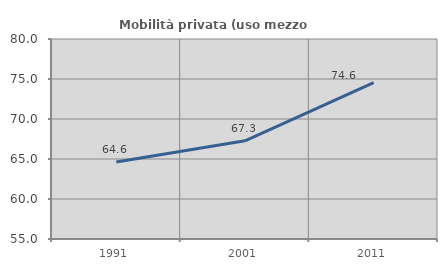
| Category | Mobilità privata (uso mezzo privato) |
|---|---|
| 1991.0 | 64.638 |
| 2001.0 | 67.273 |
| 2011.0 | 74.561 |